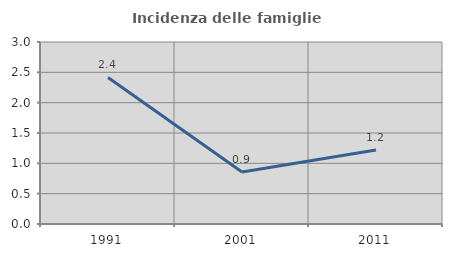
| Category | Incidenza delle famiglie numerose |
|---|---|
| 1991.0 | 2.415 |
| 2001.0 | 0.858 |
| 2011.0 | 1.22 |